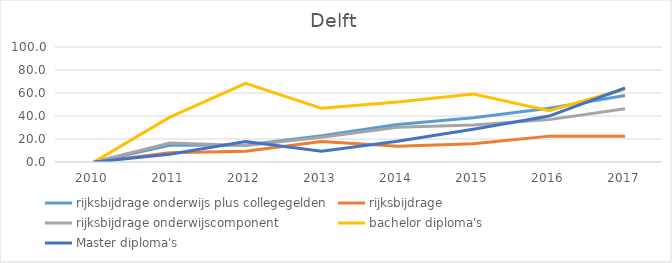
| Category | rijksbijdrage onderwijs plus collegegelden | rijksbijdrage  | rijksbijdrage onderwijscomponent | bachelor diploma's | Master diploma's |
|---|---|---|---|---|---|
| 2010.0 | 0 | 0 | 0 | 0 | 0 |
| 2011.0 | 14.519 | 8.049 | 16.588 | 39.042 | 6.705 |
| 2012.0 | 14.808 | 9.451 | 14.38 | 68.36 | 17.863 |
| 2013.0 | 22.859 | 17.838 | 21.596 | 46.662 | 9.429 |
| 2014.0 | 32.622 | 13.754 | 30.245 | 52.104 | 18.125 |
| 2015.0 | 38.493 | 15.917 | 32.115 | 59.144 | 28.549 |
| 2016.0 | 46.683 | 22.498 | 36.848 | 44.63 | 39.916 |
| 2017.0 | 57.899 | 22.293 | 46.277 | 63.498 | 64.327 |